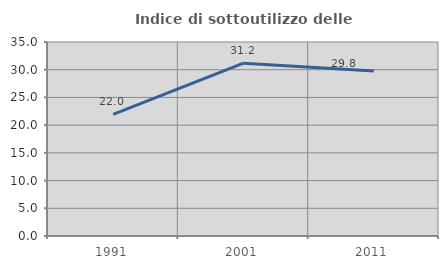
| Category | Indice di sottoutilizzo delle abitazioni  |
|---|---|
| 1991.0 | 21.961 |
| 2001.0 | 31.186 |
| 2011.0 | 29.787 |